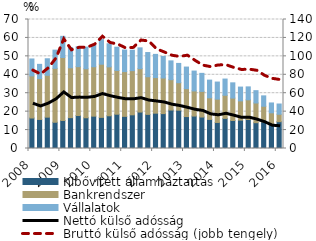
| Category | Kibővített államháztartás | Bankrendszer | Vállalatok |
|---|---|---|---|
| 2008.0 | 16.55 | 22.844 | 9.191 |
| 2008.0 | 15.766 | 22.179 | 7.719 |
| 2008.0 | 17.007 | 22.712 | 8.98 |
| 2008.0 | 14.246 | 29.259 | 9.867 |
| 2009.0 | 15.21 | 34.154 | 11.496 |
| 2009.0 | 16.735 | 27.065 | 10.981 |
| 2009.0 | 17.914 | 26.501 | 10.83 |
| 2009.0 | 16.675 | 26.59 | 11.753 |
| 2010.0 | 17.55 | 26.815 | 11.633 |
| 2010.0 | 16.894 | 28.851 | 13.352 |
| 2010.0 | 17.766 | 26.539 | 12.517 |
| 2010.0 | 18.606 | 23.75 | 12.61 |
| 2011.0 | 17.436 | 24.288 | 11.704 |
| 2011.0 | 18.274 | 23.983 | 11.067 |
| 2011.0 | 19.774 | 23.555 | 11.29 |
| 2011.0 | 18.508 | 20.429 | 13.138 |
| 2012.0 | 19.179 | 19.318 | 12.578 |
| 2012.0 | 18.933 | 19.324 | 11.677 |
| 2012.0 | 20.862 | 16.469 | 10.216 |
| 2012.0 | 20.781 | 14.923 | 10.463 |
| 2013.0 | 17.333 | 15.148 | 11.71 |
| 2013.0 | 17.602 | 13.643 | 10.775 |
| 2013.0 | 17.076 | 13.896 | 9.805 |
| 2013.0 | 15.786 | 11.721 | 9.597 |
| 2014.0 | 14.132 | 12.679 | 9.25 |
| 2014.0 | 16.357 | 12.531 | 8.799 |
| 2014.0 | 15.198 | 12.164 | 8.271 |
| 2014.0 | 15.395 | 10.451 | 7.481 |
| 2015.0 | 15.722 | 10.693 | 7.021 |
| 2015.0 | 13.995 | 10.703 | 6.684 |
| 2015.0 | 14.446 | 8.477 | 5.638 |
| 2015.0 | 13.558 | 5.797 | 5.359 |
| 2016.0 | 14.544 | 4.05 | 5.55 |